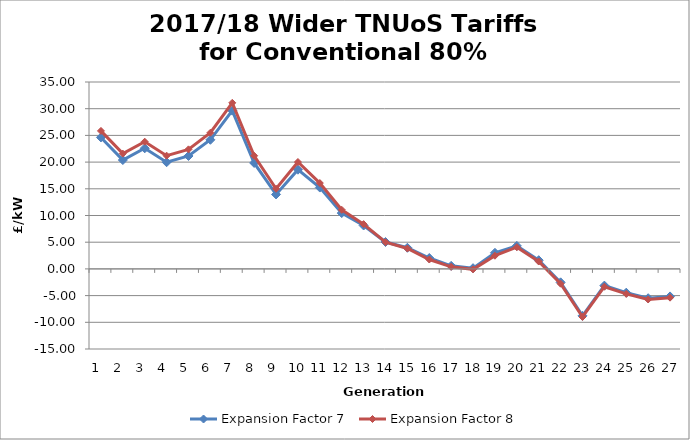
| Category | Expansion Factor 7 | Expansion Factor 8 |
|---|---|---|
| 1.0 | 24.62 | 25.841 |
| 2.0 | 20.384 | 21.587 |
| 3.0 | 22.587 | 23.817 |
| 4.0 | 19.976 | 21.206 |
| 5.0 | 21.146 | 22.388 |
| 6.0 | 24.178 | 25.497 |
| 7.0 | 29.644 | 31.1 |
| 8.0 | 19.842 | 21.187 |
| 9.0 | 13.944 | 15.008 |
| 10.0 | 18.578 | 20.018 |
| 11.0 | 15.234 | 16.077 |
| 12.0 | 10.453 | 11.07 |
| 13.0 | 8.13 | 8.385 |
| 14.0 | 5.036 | 4.991 |
| 15.0 | 3.954 | 3.82 |
| 16.0 | 2.04 | 1.755 |
| 17.0 | 0.57 | 0.392 |
| 18.0 | 0.135 | -0.085 |
| 19.0 | 3.013 | 2.469 |
| 20.0 | 4.315 | 4.067 |
| 21.0 | 1.627 | 1.382 |
| 22.0 | -2.518 | -2.771 |
| 23.0 | -8.793 | -9.002 |
| 24.0 | -3.129 | -3.337 |
| 25.0 | -4.458 | -4.682 |
| 26.0 | -5.489 | -5.721 |
| 27.0 | -5.156 | -5.39 |